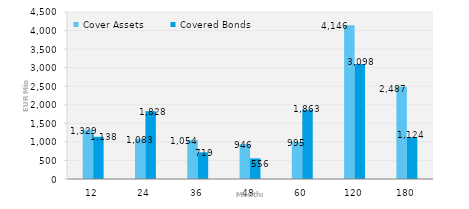
| Category | Cover Assets | Covered Bonds |
|---|---|---|
| 12.0 | 1328.889 | 1137.609 |
| 24.0 | 1083.495 | 1828.231 |
| 36.0 | 1054.298 | 718.953 |
| 48.0 | 945.591 | 555.613 |
| 60.0 | 995.202 | 1862.942 |
| 120.0 | 4145.664 | 3098 |
| 180.0 | 2487.342 | 1124.124 |